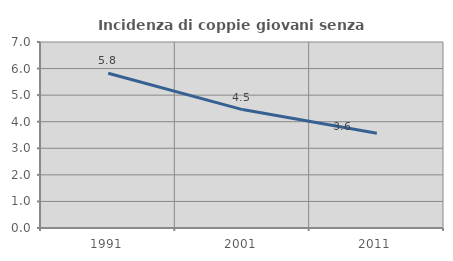
| Category | Incidenza di coppie giovani senza figli |
|---|---|
| 1991.0 | 5.824 |
| 2001.0 | 4.456 |
| 2011.0 | 3.562 |